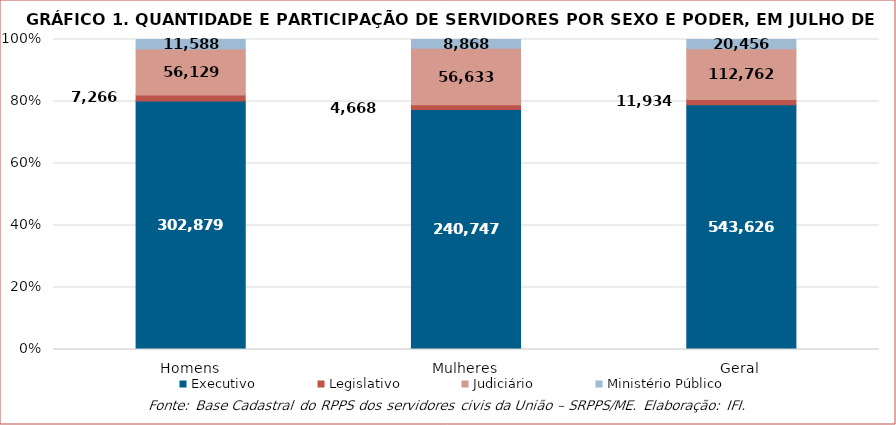
| Category | Executivo | Legislativo | Judiciário | Ministério Público |
|---|---|---|---|---|
| Homens | 302879 | 7266 | 56129 | 11588 |
| Mulheres | 240747 | 4668 | 56633 | 8868 |
| Geral | 543626 | 11934 | 112762 | 20456 |